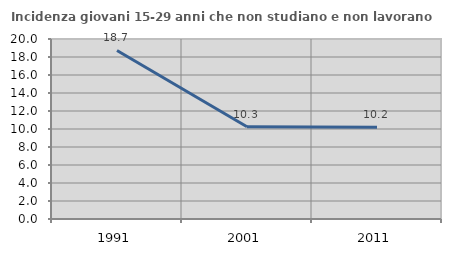
| Category | Incidenza giovani 15-29 anni che non studiano e non lavorano  |
|---|---|
| 1991.0 | 18.723 |
| 2001.0 | 10.256 |
| 2011.0 | 10.185 |